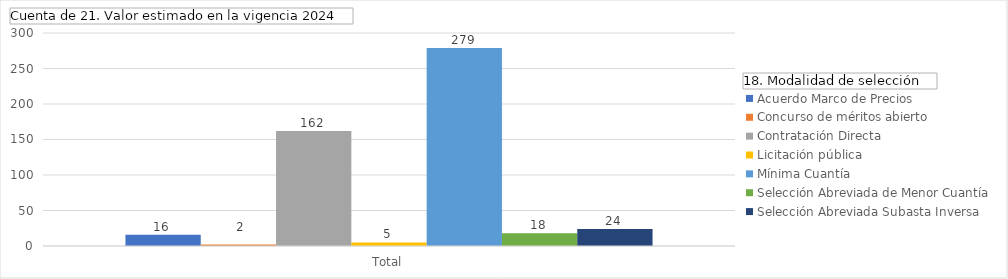
| Category | Acuerdo Marco de Precios | Concurso de méritos abierto | Contratación Directa | Licitación pública | Mínima Cuantía | Selección Abreviada de Menor Cuantía | Selección Abreviada Subasta Inversa |
|---|---|---|---|---|---|---|---|
| Total | 16 | 2 | 162 | 5 | 279 | 18 | 24 |